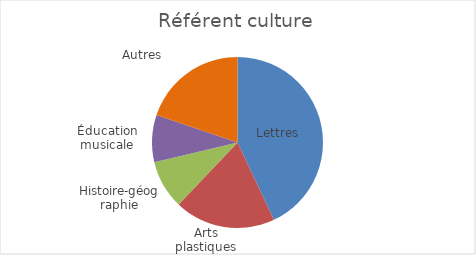
| Category | Référent culture |
|---|---|
| Lettres | 0.43 |
| Arts plastiques | 0.191 |
| Histoire-géographie | 0.092 |
| Éducation musicale | 0.089 |
| Autres | 0.198 |